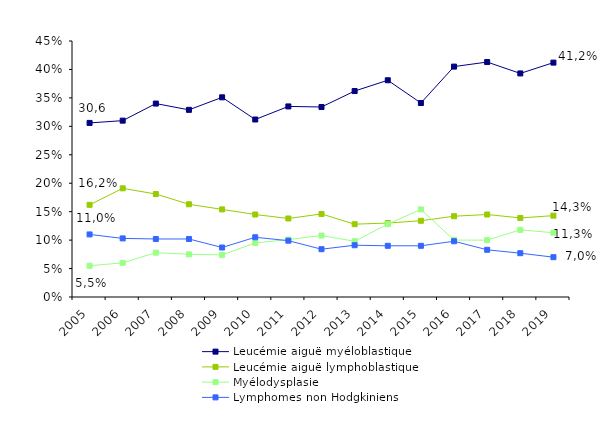
| Category | Leucémie aiguë myéloblastique | Leucémie aiguë lymphoblastique | Myélodysplasie | Lymphomes non Hodgkiniens |
|---|---|---|---|---|
| 2005.0 | 0.306 | 0.162 | 0.055 | 0.11 |
| 2006.0 | 0.31 | 0.191 | 0.06 | 0.103 |
| 2007.0 | 0.34 | 0.181 | 0.078 | 0.102 |
| 2008.0 | 0.329 | 0.163 | 0.075 | 0.102 |
| 2009.0 | 0.351 | 0.154 | 0.074 | 0.087 |
| 2010.0 | 0.312 | 0.145 | 0.095 | 0.105 |
| 2011.0 | 0.335 | 0.138 | 0.101 | 0.099 |
| 2012.0 | 0.334 | 0.146 | 0.108 | 0.084 |
| 2013.0 | 0.362 | 0.128 | 0.098 | 0.091 |
| 2014.0 | 0.381 | 0.13 | 0.128 | 0.09 |
| 2015.0 | 0.341 | 0.134 | 0.154 | 0.09 |
| 2016.0 | 0.405 | 0.142 | 0.1 | 0.098 |
| 2017.0 | 0.413 | 0.145 | 0.1 | 0.083 |
| 2018.0 | 0.393 | 0.139 | 0.118 | 0.077 |
| 2019.0 | 0.412 | 0.143 | 0.113 | 0.07 |